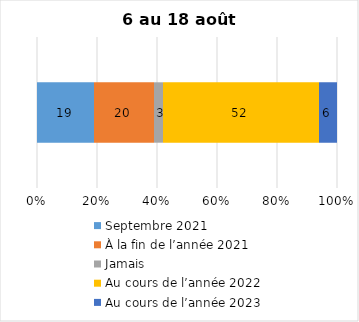
| Category | Septembre 2021 | À la fin de l’année 2021 | Jamais | Au cours de l’année 2022 | Au cours de l’année 2023 |
|---|---|---|---|---|---|
| 0 | 19 | 20 | 3 | 52 | 6 |